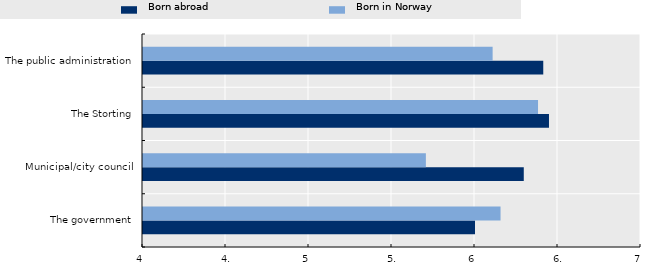
| Category | Born abroad | Born in Norway |
|---|---|---|
| The government | 6 | 6.154 |
| Municipal/city council | 6.294 | 5.704 |
| The Storting | 6.446 | 6.38 |
| The public administration | 6.411 | 6.106 |